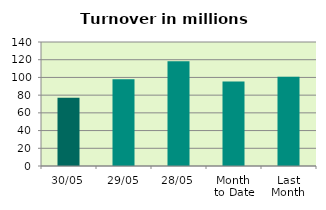
| Category | Series 0 |
|---|---|
| 30/05 | 77.003 |
| 29/05 | 97.809 |
| 28/05 | 118.34 |
| Month 
to Date | 95.263 |
| Last
Month | 100.792 |